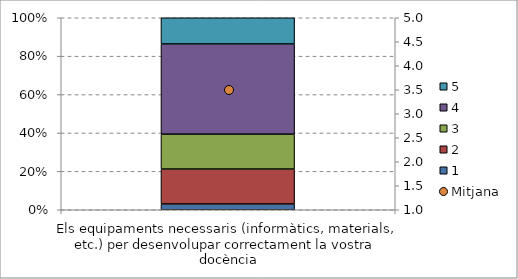
| Category | 1 | 2 | 3 | 4 | 5 |
|---|---|---|---|---|---|
| Els equipaments necessaris (informàtics, materials, etc.) per desenvolupar correctament la vostra docència | 2 | 12 | 12 | 31 | 9 |